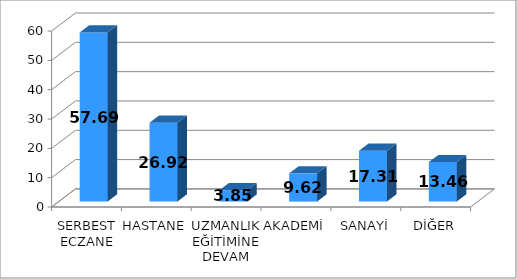
| Category | Series 0 |
|---|---|
| SERBEST ECZANE | 57.69 |
| HASTANE | 26.92 |
| UZMANLIK EĞİTİMİNE DEVAM | 3.85 |
| AKADEMİ | 9.62 |
| SANAYİ | 17.31 |
| DİĞER | 13.46 |